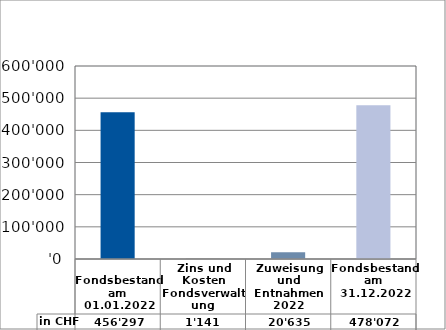
| Category | in CHF |
|---|---|
| 
Fondsbestand am 01.01.2022

 | 456297.16 |
| Zins und Kosten Fondsverwaltung | 1140.74 |
| Zuweisung und Entnahmen 2022 | 20634.55 |
| Fondsbestand am 31.12.2022 | 478072.45 |